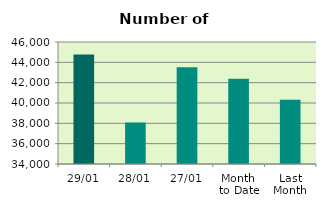
| Category | Series 0 |
|---|---|
| 29/01 | 44774 |
| 28/01 | 38080 |
| 27/01 | 43510 |
| Month 
to Date | 42385.6 |
| Last
Month | 40313.8 |